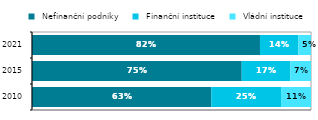
| Category |  Nefinanční podniky  |  Finanční instituce  |  Vládní instituce  |
|---|---|---|---|
| 2010.0 | 0.634 | 0.247 | 0.106 |
| 2015.0 | 0.746 | 0.173 | 0.073 |
| 2021.0 | 0.816 | 0.137 | 0.046 |